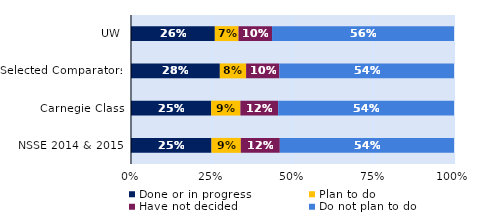
| Category | Done or in progress | Plan to do | Have not decided | Do not plan to do |
|---|---|---|---|---|
| UW | 0.26 | 0.073 | 0.104 | 0.563 |
| Selected Comparators | 0.275 | 0.081 | 0.103 | 0.541 |
| Carnegie Class | 0.248 | 0.091 | 0.117 | 0.544 |
| NSSE 2014 & 2015 | 0.249 | 0.091 | 0.121 | 0.539 |